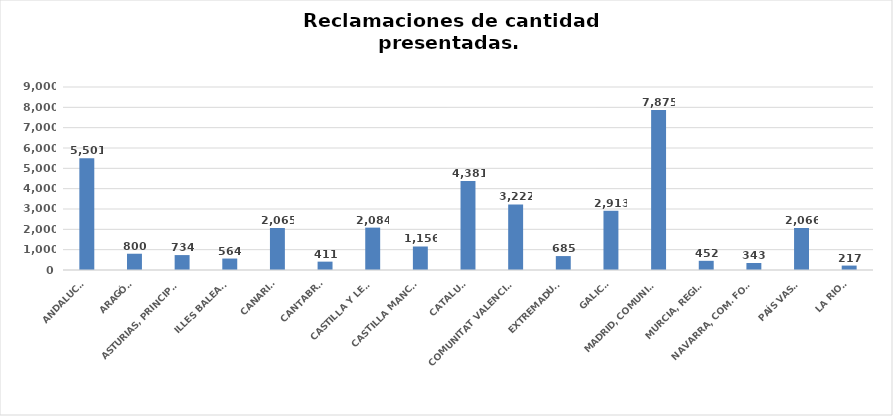
| Category | Series 0 |
|---|---|
| ANDALUCÍA | 5501 |
| ARAGÓN | 800 |
| ASTURIAS, PRINCIPADO | 734 |
| ILLES BALEARS | 564 |
| CANARIAS | 2065 |
| CANTABRIA | 411 |
| CASTILLA Y LEÓN | 2084 |
| CASTILLA MANCHA | 1156 |
| CATALUÑA | 4381 |
| COMUNITAT VALENCIANA | 3222 |
| EXTREMADURA | 685 |
| GALICIA | 2913 |
| MADRID, COMUNIDAD | 7875 |
| MURCIA, REGIÓN | 452 |
| NAVARRA, COM. FORAL | 343 |
| PAÍS VASCO | 2066 |
| LA RIOJA | 217 |